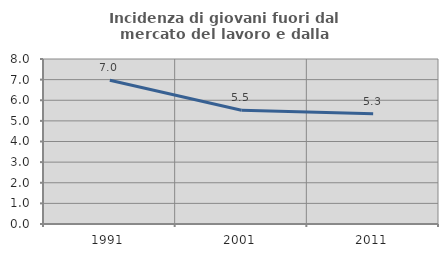
| Category | Incidenza di giovani fuori dal mercato del lavoro e dalla formazione  |
|---|---|
| 1991.0 | 6.973 |
| 2001.0 | 5.517 |
| 2011.0 | 5.34 |